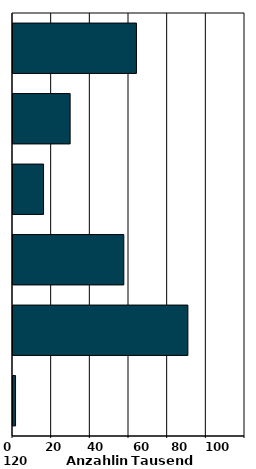
| Category | Series 0 |
|---|---|
| 0 | 1.324 |
| 1 | 90.46 |
| 2 | 57.32 |
| 3 | 15.806 |
| 4 | 29.553 |
| 5 | 63.846 |